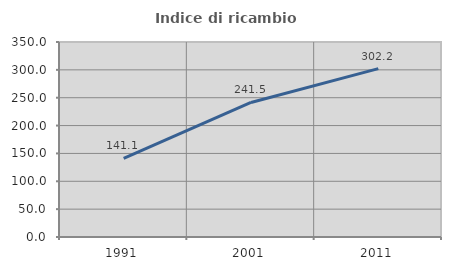
| Category | Indice di ricambio occupazionale  |
|---|---|
| 1991.0 | 141.135 |
| 2001.0 | 241.509 |
| 2011.0 | 302.151 |